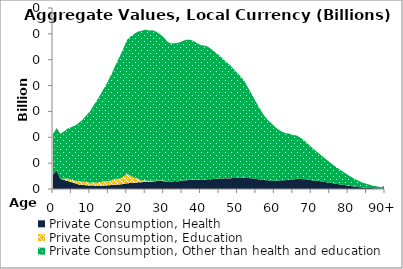
| Category | Private Consumption, Health | Private Consumption, Education | Private Consumption, Other than health and education |
|---|---|---|---|
| 0 | 5.633 | 0 | 15.692 |
|  | 7.079 | 0 | 16.501 |
| 2 | 3.946 | 0 | 17.367 |
| 3 | 3.498 | 0.502 | 18.295 |
| 4 | 3.066 | 1.042 | 19.286 |
| 5 | 2.643 | 0.953 | 20.342 |
| 6 | 2.22 | 1.046 | 21.297 |
| 7 | 1.722 | 1.327 | 22.521 |
| 8 | 1.551 | 1.31 | 23.95 |
| 9 | 1.458 | 1.343 | 25.655 |
| 10 | 1.326 | 1.084 | 27.558 |
| 11 | 1.314 | 1.263 | 29.759 |
| 12 | 1.277 | 1.176 | 32.051 |
| 13 | 1.263 | 1.505 | 34.126 |
| 14 | 1.313 | 1.735 | 36.341 |
| 15 | 1.445 | 1.502 | 39.029 |
| 16 | 1.54 | 1.953 | 41.342 |
| 17 | 1.647 | 2.298 | 44.185 |
| 18 | 1.743 | 2.191 | 47.004 |
| 19 | 1.932 | 2.724 | 49.437 |
| 20 | 2.2 | 3.681 | 51.662 |
| 21 | 2.32 | 2.867 | 53.794 |
| 22 | 2.322 | 2.157 | 55.522 |
| 23 | 2.557 | 1.448 | 56.848 |
| 24 | 2.624 | 0.675 | 57.885 |
| 25 | 2.788 | 0.592 | 58.276 |
| 26 | 2.798 | 0.329 | 58.145 |
| 27 | 2.904 | 0.273 | 58.247 |
| 28 | 3.051 | 0.176 | 57.588 |
| 29 | 3.086 | 0.176 | 56.648 |
| 30 | 3.037 | 0.269 | 55.419 |
| 31 | 2.884 | 0.018 | 54.086 |
| 32 | 2.895 | 0.073 | 53.317 |
| 33 | 3.056 | 0.04 | 53.312 |
| 34 | 3.013 | 0.037 | 53.506 |
| 35 | 3.266 | 0.044 | 53.842 |
| 36 | 3.355 | 0.034 | 54.308 |
| 37 | 3.518 | 0.082 | 54.145 |
| 38 | 3.477 | 0.074 | 53.821 |
| 39 | 3.455 | 0.125 | 52.885 |
| 40 | 3.454 | 0.063 | 52.164 |
| 41 | 3.58 | 0.021 | 51.864 |
| 42 | 3.747 | 0.023 | 51.281 |
| 43 | 3.779 | 0.008 | 50.19 |
| 44 | 3.964 | 0.032 | 48.88 |
| 45 | 4.015 | 0.036 | 47.697 |
| 46 | 4.054 | 0.02 | 46.355 |
| 47 | 4.167 | 0.044 | 44.846 |
| 48 | 4.176 | 0.063 | 43.693 |
| 49 | 4.24 | 0.002 | 42.106 |
| 50 | 4.306 | 0.016 | 40.515 |
| 51 | 4.358 | 0.019 | 38.962 |
| 52 | 4.38 | 0.011 | 37.062 |
| 53 | 4.223 | 0.008 | 34.656 |
| 54 | 4.147 | 0.013 | 32.289 |
| 55 | 3.885 | 0.009 | 29.814 |
| 56 | 3.72 | 0.001 | 27.565 |
| 57 | 3.525 | 0 | 25.348 |
| 58 | 3.365 | 0.001 | 23.704 |
| 59 | 3.282 | 0 | 22.386 |
| 60 | 3.235 | 0 | 21.068 |
| 61 | 3.219 | 0 | 19.861 |
| 62 | 3.412 | 0.002 | 18.766 |
| 63 | 3.406 | 0 | 18.207 |
| 64 | 3.627 | 0.002 | 17.794 |
| 65 | 3.652 | 0 | 17.223 |
| 66 | 3.937 | 0 | 16.787 |
| 67 | 3.914 | 0.001 | 16.059 |
| 68 | 3.768 | 0 | 15.129 |
| 69 | 3.715 | 0 | 13.949 |
| 70 | 3.395 | 0.003 | 12.884 |
| 71 | 3.215 | 0 | 11.774 |
| 72 | 3.154 | 0 | 10.776 |
| 73 | 2.811 | 0 | 9.845 |
| 74 | 2.651 | 0 | 8.897 |
| 75 | 2.452 | 0.002 | 7.919 |
| 76 | 2.207 | 0.002 | 7.061 |
| 77 | 1.964 | 0 | 6.282 |
| 78 | 1.712 | 0 | 5.599 |
| 79 | 1.534 | 0 | 4.845 |
| 80 | 1.274 | 0 | 4.119 |
| 81 | 1.074 | 0 | 3.443 |
| 82 | 0.89 | 0 | 2.862 |
| 83 | 0.724 | 0 | 2.335 |
| 84 | 0.579 | 0.001 | 1.857 |
| 85 | 0.487 | 0 | 1.543 |
| 86 | 0.385 | 0 | 1.222 |
| 87 | 0.297 | 0 | 0.946 |
| 88 | 0.224 | 0 | 0.713 |
| 89 | 0.163 | 0 | 0.522 |
| 90+ | 0.337 | 0 | 1.078 |